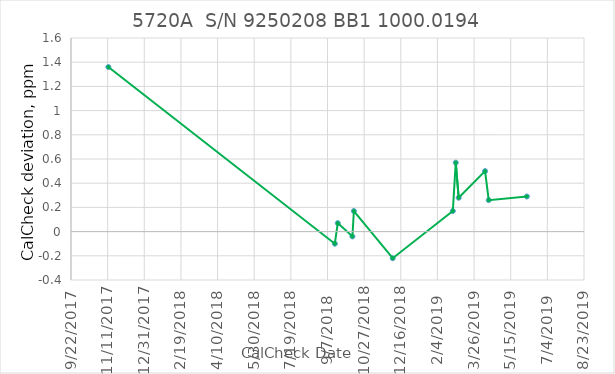
| Category | Series 0 |
|---|---|
| 43051.0 | 1.36 |
| 43360.0 | -0.1 |
| 43364.0 | 0.07 |
| 43384.0 | -0.04 |
| 43386.0 | 0.17 |
| 43439.0 | -0.22 |
| 43521.0 | 0.17 |
| 43525.0 | 0.57 |
| 43529.0 | 0.28 |
| 43565.0 | 0.5 |
| 43570.0 | 0.26 |
| 43622.0 | 0.29 |